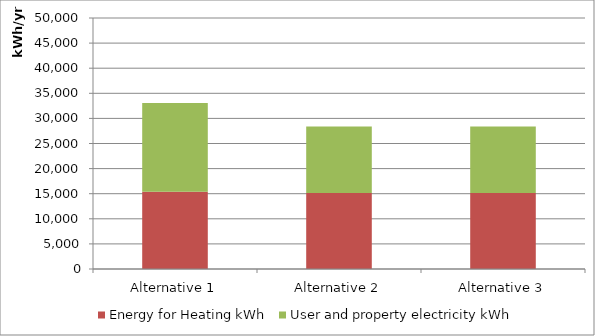
| Category | Energy for Heating kWh | User and property electricity kWh |
|---|---|---|
| Alternative 1 | 15390.678 | 17656.128 |
| Alternative 2 | 15154.423 | 13242.096 |
| Alternative 3 | 15154.423 | 13242.096 |